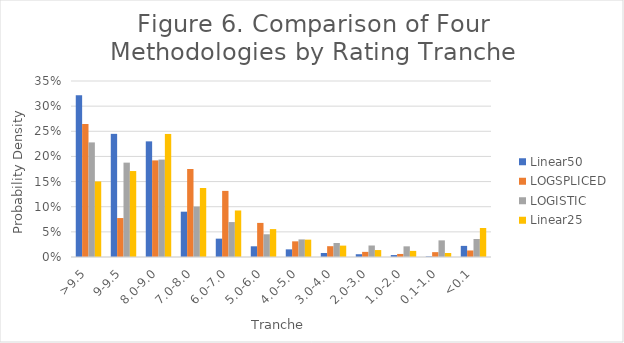
| Category | Linear50 | LOGSPLICED | LOGISTIC | Linear25 |
|---|---|---|---|---|
| >9.5 | 0.321 | 0.265 | 0.228 | 0.15 |
| 9-9.5 | 0.245 | 0.077 | 0.188 | 0.171 |
| 8.0-9.0 | 0.23 | 0.192 | 0.194 | 0.245 |
| 7.0-8.0 | 0.09 | 0.175 | 0.1 | 0.137 |
| 6.0-7.0 | 0.036 | 0.131 | 0.069 | 0.093 |
| 5.0-6.0 | 0.021 | 0.068 | 0.045 | 0.056 |
| 4.0-5.0 | 0.015 | 0.031 | 0.035 | 0.035 |
| 3.0-4.0 | 0.008 | 0.021 | 0.028 | 0.023 |
| 2.0-3.0 | 0.006 | 0.01 | 0.023 | 0.014 |
| 1.0-2.0 | 0.004 | 0.006 | 0.021 | 0.012 |
| 0.1-1.0 | 0.001 | 0.01 | 0.033 | 0.008 |
| <0.1 | 0.022 | 0.013 | 0.036 | 0.058 |